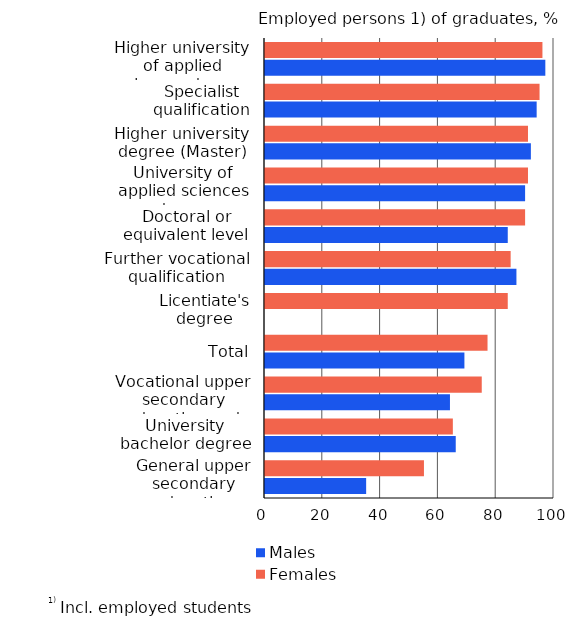
| Category | Males | Females |
|---|---|---|
| General upper secondary education | 35 | 55 |
| University bachelor degree | 66 | 65 |
| Vocational upper secondary education and training | 64 | 75 |
| Total | 69 | 77 |
| Licentiate's degree | 0 | 84 |
| Further vocational qualification | 87 | 85 |
| Doctoral or equivalent level | 84 | 90 |
| University of applied sciences degree | 90 | 91 |
| Higher university degree (Master) | 92 | 91 |
| Specialist qualification | 94 | 95 |
| Higher university of applied sciences degree (Master) | 97 | 96 |